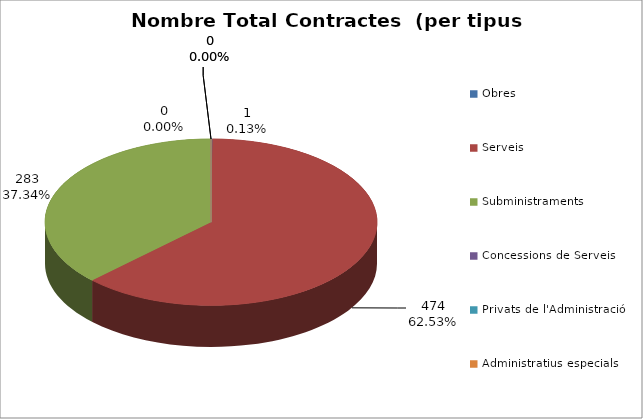
| Category | Nombre Total Contractes |
|---|---|
| Obres | 1 |
| Serveis | 474 |
| Subministraments | 283 |
| Concessions de Serveis | 0 |
| Privats de l'Administració | 0 |
| Administratius especials | 0 |